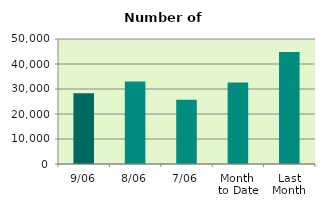
| Category | Series 0 |
|---|---|
| 9/06 | 28274 |
| 8/06 | 33030 |
| 7/06 | 25698 |
| Month 
to Date | 32603.714 |
| Last
Month | 44751.81 |